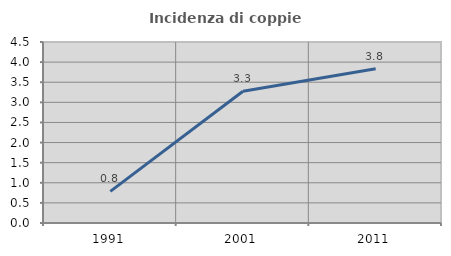
| Category | Incidenza di coppie miste |
|---|---|
| 1991.0 | 0.787 |
| 2001.0 | 3.275 |
| 2011.0 | 3.834 |